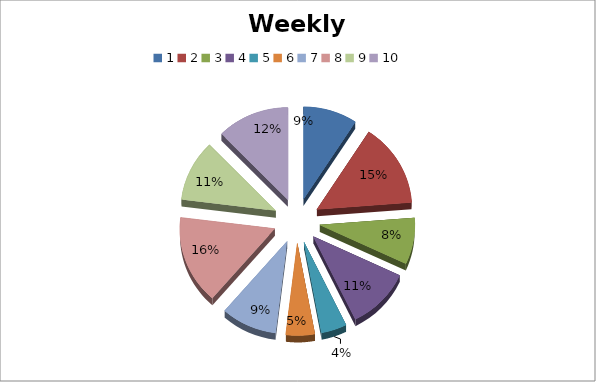
| Category | Series 0 |
|---|---|
| 0 | 37690 |
| 1 | 59950 |
| 2 | 33300 |
| 3 | 44360 |
| 4 | 17790 |
| 5 | 20130 |
| 6 | 38885 |
| 7 | 63700 |
| 8 | 44090 |
| 9 | 50550 |